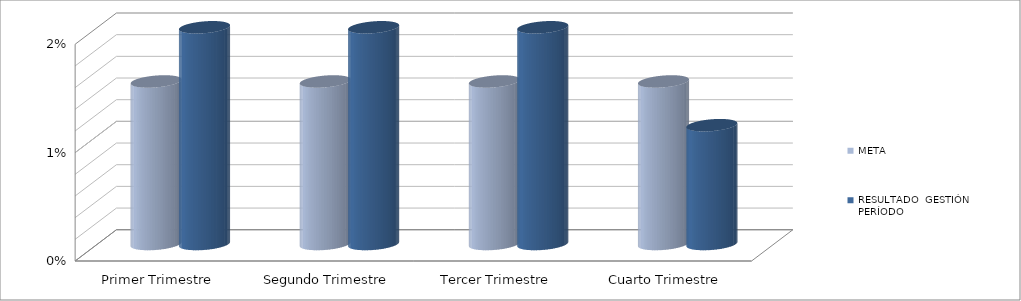
| Category | META | RESULTADO  GESTIÓN PERÍODO |
|---|---|---|
| Primer Trimestre | 0.015 | 0.03 |
| Segundo Trimestre | 0.015 | 0.028 |
| Tercer Trimestre | 0.015 | 0.024 |
| Cuarto Trimestre | 0.015 | 0.011 |